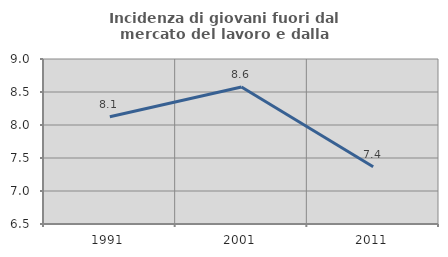
| Category | Incidenza di giovani fuori dal mercato del lavoro e dalla formazione  |
|---|---|
| 1991.0 | 8.125 |
| 2001.0 | 8.577 |
| 2011.0 | 7.366 |